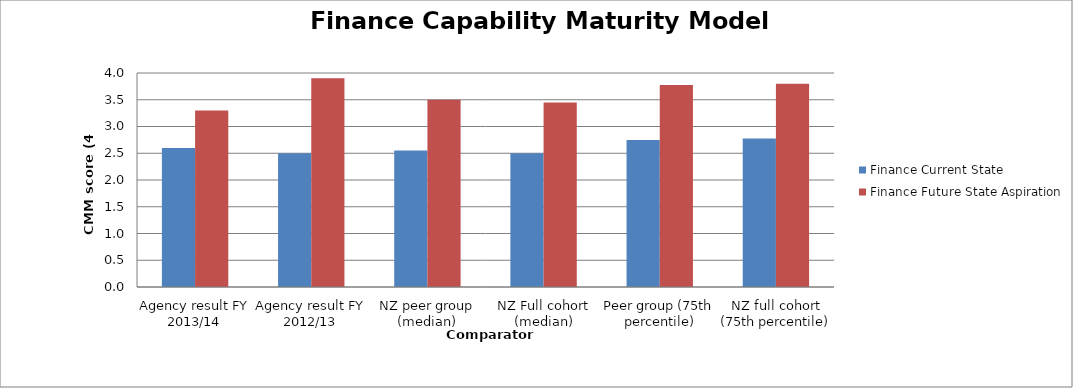
| Category | Finance Current State | Finance Future State Aspiration |
|---|---|---|
| Agency result FY 2013/14 | 2.6 | 3.3 |
| Agency result FY 2012/13 | 2.5 | 3.9 |
| NZ peer group (median) | 2.55 | 3.5 |
| NZ Full cohort (median) | 2.5 | 3.45 |
| Peer group (75th percentile) | 2.75 | 3.775 |
| NZ full cohort (75th percentile) | 2.775 | 3.8 |